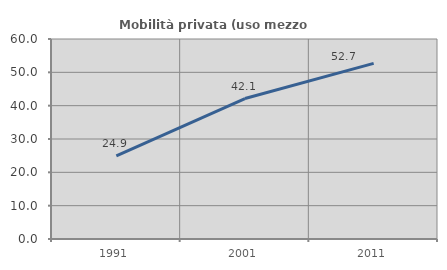
| Category | Mobilità privata (uso mezzo privato) |
|---|---|
| 1991.0 | 24.904 |
| 2001.0 | 42.145 |
| 2011.0 | 52.693 |